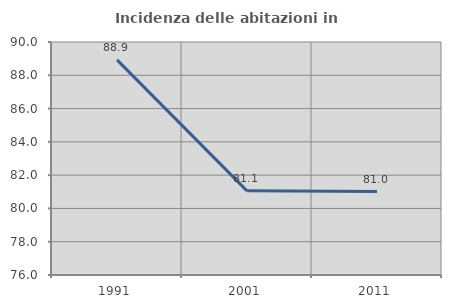
| Category | Incidenza delle abitazioni in proprietà  |
|---|---|
| 1991.0 | 88.929 |
| 2001.0 | 81.056 |
| 2011.0 | 81.016 |